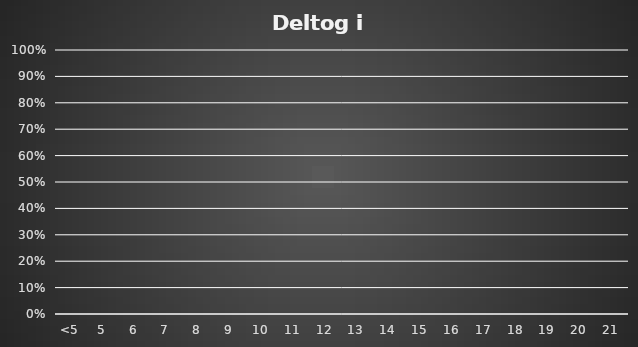
| Category | Series 0 |
|---|---|
| <5 | 0 |
| 5 | 0 |
| 6 | 0 |
| 7 | 0 |
| 8 | 0 |
| 9 | 0 |
| 10 | 0 |
| 11 | 0 |
| 12 | 0 |
| 13 | 0 |
| 14 | 0 |
| 15 | 0 |
| 16 | 0 |
| 17 | 0 |
| 18 | 0 |
| 19 | 0 |
| 20 | 0 |
| 21 | 0 |